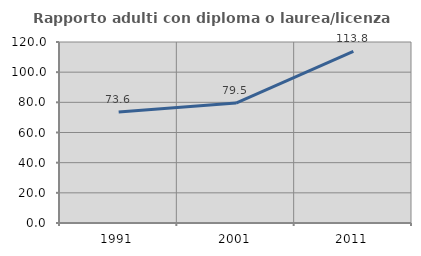
| Category | Rapporto adulti con diploma o laurea/licenza media  |
|---|---|
| 1991.0 | 73.636 |
| 2001.0 | 79.503 |
| 2011.0 | 113.772 |